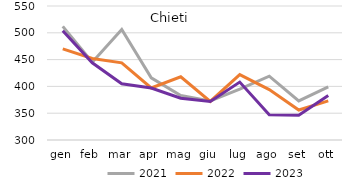
| Category | 2021 | 2022 | 2023 |
|---|---|---|---|
| gen | 512 | 470 | 504 |
| feb | 445 | 452 | 444 |
| mar | 506 | 444 | 405 |
| apr | 416 | 397 | 397 |
| mag | 383 | 418 | 378 |
| giu | 373 | 372 | 372 |
| lug | 395 | 422 | 408 |
| ago | 419 | 394 | 347 |
| set | 373 | 356 | 346 |
| ott | 399 | 373 | 383 |